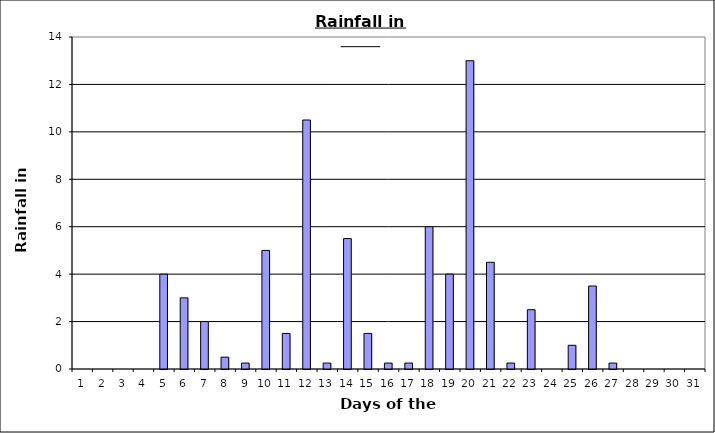
| Category | Series 0 |
|---|---|
| 0 | 0 |
| 1 | 0 |
| 2 | 0 |
| 3 | 0 |
| 4 | 4 |
| 5 | 3 |
| 6 | 2 |
| 7 | 0.5 |
| 8 | 0.25 |
| 9 | 5 |
| 10 | 1.5 |
| 11 | 10.5 |
| 12 | 0.25 |
| 13 | 5.5 |
| 14 | 1.5 |
| 15 | 0.25 |
| 16 | 0.25 |
| 17 | 6 |
| 18 | 4 |
| 19 | 13 |
| 20 | 4.5 |
| 21 | 0.25 |
| 22 | 2.5 |
| 23 | 0 |
| 24 | 1 |
| 25 | 3.5 |
| 26 | 0.25 |
| 27 | 0 |
| 28 | 0 |
| 29 | 0 |
| 30 | 0 |